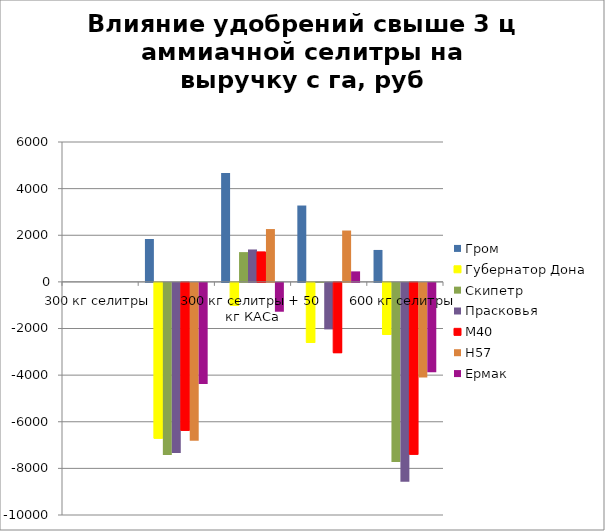
| Category | Гром | Губернатор Дона | Скипетр | Прасковья | М40 | Н57 | Ермак |
|---|---|---|---|---|---|---|---|
| 300 кг селитры | 0 | 0 | 0 | 0 | 0 | 0 | 0 |
| 300 кг селитры + 200 кг сульфата кальция | 1839.705 | -6684.767 | -7384.302 | -7292.651 | -6348.279 | -6773.736 | -4339.651 |
| 300 кг селитры + 50 кг КАСа | 4667.674 | -980.116 | 1276.628 | 1389.922 | 1286.109 | 2265.829 | -1237.907 |
| 400 кг селитры | 3275.349 | -2575.558 | 5.326 | -1995.426 | -3015.581 | 2202.775 | 450.279 |
| 600 кг селитры | 1369.953 | -2233.713 | -7678.302 | -8531.891 | -7374.682 | -4055.116 | -3834.349 |